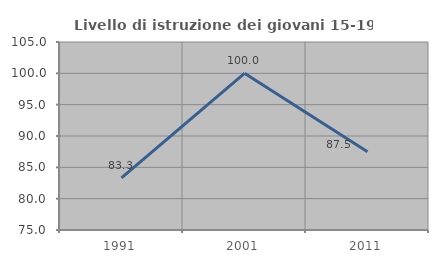
| Category | Livello di istruzione dei giovani 15-19 anni |
|---|---|
| 1991.0 | 83.333 |
| 2001.0 | 100 |
| 2011.0 | 87.5 |